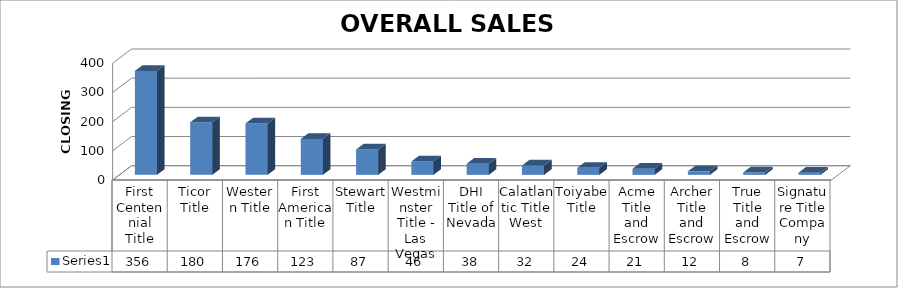
| Category | Series 0 |
|---|---|
| First Centennial Title | 356 |
| Ticor Title | 180 |
| Western Title | 176 |
| First American Title | 123 |
| Stewart Title | 87 |
| Westminster Title - Las Vegas | 46 |
| DHI Title of Nevada | 38 |
| Calatlantic Title West | 32 |
| Toiyabe Title | 24 |
| Acme Title and Escrow | 21 |
| Archer Title and Escrow | 12 |
| True Title and Escrow | 8 |
| Signature Title Company | 7 |